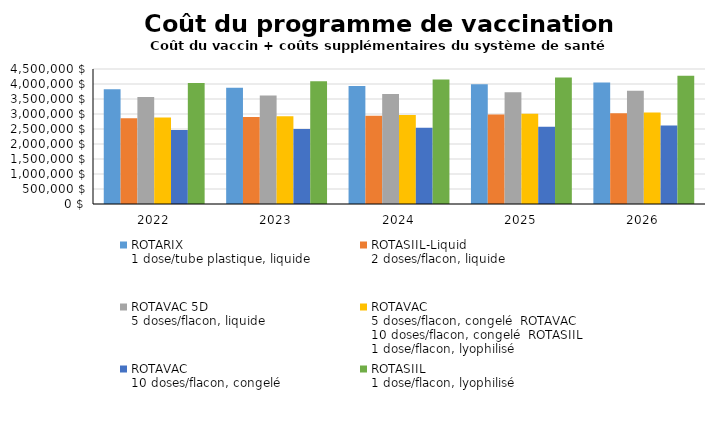
| Category | ROTARIX
1 dose/tube plastique, liquide | ROTASIIL-Liquid
2 doses/flacon, liquide | ROTAVAC 5D
5 doses/flacon, liquide | ROTAVAC
5 doses/flacon, congelé ROTAVAC
10 doses/flacon, congelé ROTASIIL
1 dose/flacon, lyophilisé | ROTAVAC
10 doses/flacon, congelé | ROTASIIL
1 dose/flacon, lyophilisé |
|---|---|---|---|---|---|---|
| 2022.0 | 3822408.333 | 2854421.538 | 3564718.621 | 2879475.789 | 2468045.106 | 4034397.5 |
| 2023.0 | 3877973.553 | 2895915.421 | 3616537.882 | 2921333.878 | 2503922.349 | 4093044.344 |
| 2024.0 | 3934346.509 | 2938012.487 | 3669110.424 | 2963800.445 | 2540321.128 | 4152543.72 |
| 2025.0 | 3991538.941 | 2980721.506 | 3722447.198 | 3006884.336 | 2577249.025 | 4212908.02 |
| 2026.0 | 4049562.763 | 3024051.374 | 3776559.312 | 3050594.525 | 2614713.732 | 4274149.819 |